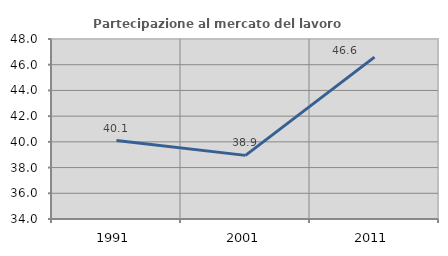
| Category | Partecipazione al mercato del lavoro  femminile |
|---|---|
| 1991.0 | 40.101 |
| 2001.0 | 38.949 |
| 2011.0 | 46.592 |